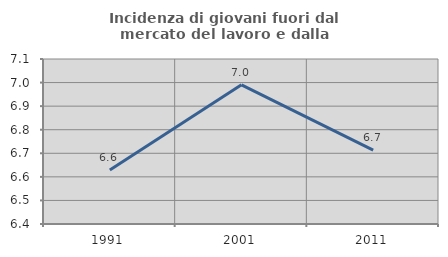
| Category | Incidenza di giovani fuori dal mercato del lavoro e dalla formazione  |
|---|---|
| 1991.0 | 6.629 |
| 2001.0 | 6.99 |
| 2011.0 | 6.714 |